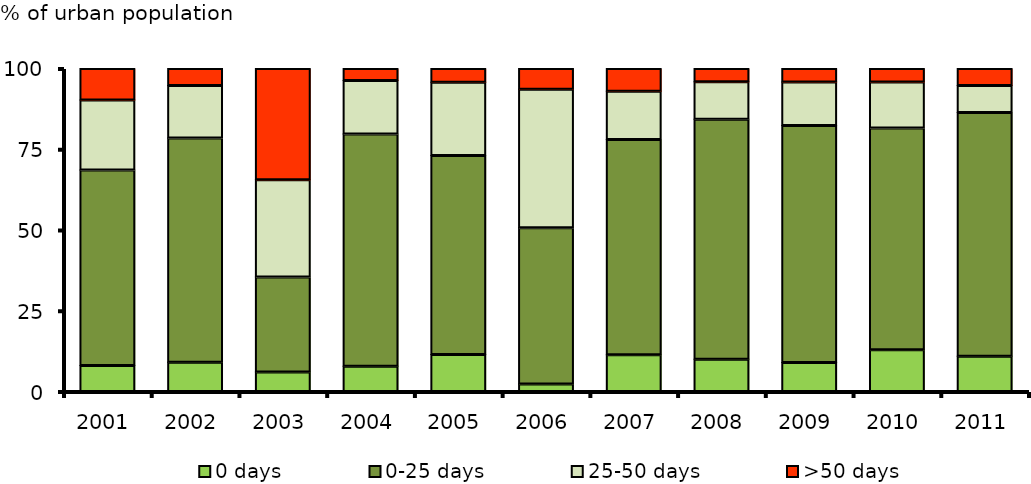
| Category | 0 days | 0-25 days | 25-50 days | >50 days |
|---|---|---|---|---|
| 2001.0 | 8.025 | 60.552 | 21.64 | 9.783 |
| 2002.0 | 9.048 | 69.464 | 16.21 | 5.278 |
| 2003.0 | 6.071 | 29.393 | 30.122 | 34.414 |
| 2004.0 | 7.805 | 71.936 | 16.571 | 3.688 |
| 2005.0 | 11.45 | 61.635 | 22.648 | 4.266 |
| 2006.0 | 2.292 | 48.392 | 42.913 | 6.403 |
| 2007.0 | 11.366 | 66.641 | 14.918 | 7.076 |
| 2008.0 | 9.963 | 74.333 | 11.581 | 4.123 |
| 2009.0 | 9.003 | 73.316 | 13.53 | 4.15 |
| 2010.0 | 12.907 | 68.668 | 14.22 | 4.205 |
| 2011.0 | 10.933 | 75.439 | 8.352 | 5.276 |